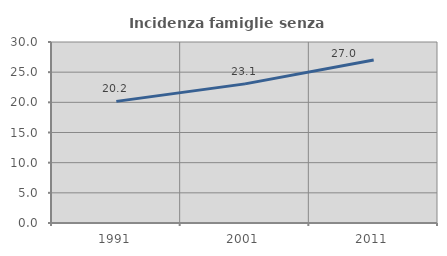
| Category | Incidenza famiglie senza nuclei |
|---|---|
| 1991.0 | 20.158 |
| 2001.0 | 23.057 |
| 2011.0 | 27.002 |